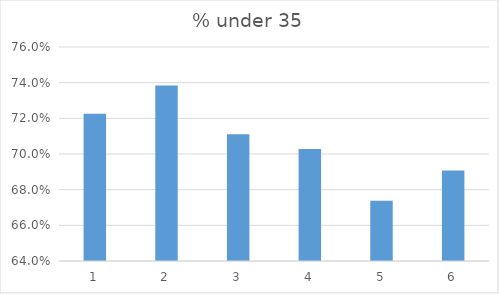
| Category | % under 35 |
|---|---|
| 0 | 0.723 |
| 1 | 0.738 |
| 2 | 0.711 |
| 3 | 0.703 |
| 4 | 0.674 |
| 5 | 0.691 |